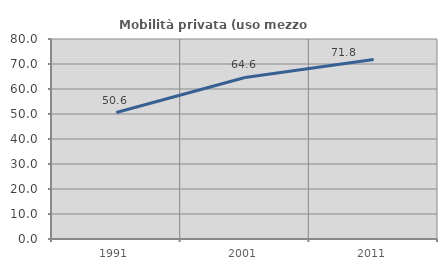
| Category | Mobilità privata (uso mezzo privato) |
|---|---|
| 1991.0 | 50.59 |
| 2001.0 | 64.602 |
| 2011.0 | 71.79 |